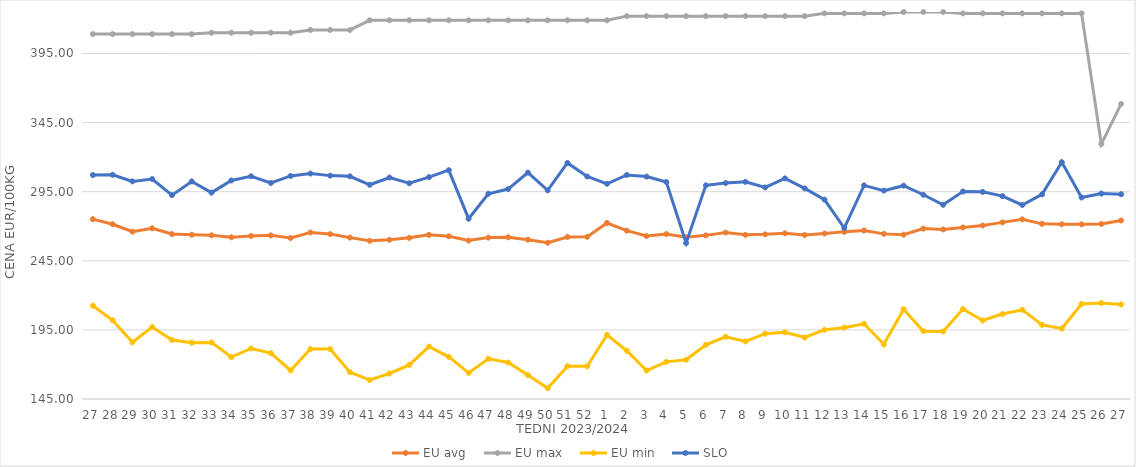
| Category | EU avg | EU max | EU min | SLO |
|---|---|---|---|---|
| 27.0 | 275.123 | 409 | 212.506 | 307.04 |
| 28.0 | 271.42 | 409 | 201.945 | 307.23 |
| 29.0 | 266.08 | 409 | 186.018 | 302.45 |
| 30.0 | 268.49 | 409 | 197.093 | 304.14 |
| 31.0 | 264.334 | 409 | 187.684 | 292.49 |
| 32.0 | 263.844 | 409 | 185.774 | 302.41 |
| 33.0 | 263.441 | 410 | 185.951 | 294.3 |
| 34.0 | 262.028 | 410 | 175.332 | 303.1 |
| 35.0 | 262.997 | 410 | 181.543 | 306.13 |
| 36.0 | 263.389 | 410 | 178.207 | 301.32 |
| 37.0 | 261.486 | 410 | 165.697 | 306.4 |
| 38.0 | 265.47 | 412 | 181.159 | 308.12 |
| 39.0 | 264.316 | 412 | 181.124 | 306.62 |
| 40.0 | 261.774 | 412 | 164.37 | 306.1 |
| 41.0 | 259.456 | 419 | 158.728 | 300 |
| 42.0 | 260.21 | 419 | 163.464 | 305.24 |
| 43.0 | 261.605 | 419 | 169.66 | 301.07 |
| 44.0 | 263.758 | 419 | 182.925 | 305.52 |
| 45.0 | 262.714 | 419 | 175.524 | 310.58 |
| 46.0 | 259.625 | 419 | 163.882 | 275.46 |
| 47.0 | 261.772 | 419 | 174.136 | 293.51 |
| 48.0 | 262.018 | 419 | 171.4 | 296.9 |
| 49.0 | 260.246 | 419 | 162.336 | 308.8 |
| 50.0 | 258.042 | 419 | 152.762 | 295.97 |
| 51.0 | 262.231 | 419 | 168.739 | 315.82 |
| 52.0 | 262.325 | 419 | 168.659 | 305.97 |
| 1.0 | 272.352 | 419 | 191.406 | 300.71 |
| 2.0 | 266.798 | 422 | 179.926 | 307.09 |
| 3.0 | 262.938 | 422 | 165.575 | 305.92 |
| 4.0 | 264.34 | 422 | 171.865 | 301.97 |
| 5.0 | 262.015 | 422 | 173.378 | 257.83 |
| 6.0 | 263.39 | 422 | 184.141 | 299.57 |
| 7.0 | 265.419 | 422 | 190.004 | 301.25 |
| 8.0 | 263.762 | 422 | 186.634 | 302.13 |
| 9.0 | 264.137 | 422 | 192.243 | 298.07 |
| 10.0 | 264.859 | 422 | 193.276 | 304.62 |
| 11.0 | 263.652 | 422 | 189.495 | 297.35 |
| 12.0 | 264.728 | 424 | 195.103 | 289.25 |
| 13.0 | 265.942 | 424 | 196.623 | 268.71 |
| 14.0 | 266.881 | 424 | 199.39 | 299.54 |
| 15.0 | 264.469 | 424 | 184.549 | 295.76 |
| 16.0 | 263.92 | 425 | 209.956 | 299.34 |
| 17.0 | 268.274 | 425 | 194.091 | 292.78 |
| 18.0 | 267.67 | 425 | 193.924 | 285.52 |
| 19.0 | 269.114 | 424 | 210.073 | 295.12 |
| 20.0 | 270.554 | 424 | 201.817 | 294.86 |
| 21.0 | 272.784 | 424 | 206.456 | 291.76 |
| 22.0 | 275.002 | 424 | 209.481 | 285.37 |
| 23.0 | 271.708 | 424 | 198.618 | 293.03 |
| 24.0 | 271.467 | 424 | 195.961 | 316.37 |
| 25.0 | 271.362 | 424 | 213.708 | 290.79 |
| 26.0 | 271.655 | 329.438 | 214.393 | 293.67 |
| 27.0 | 274.13 | 358.474 | 213.396 | 293.17 |